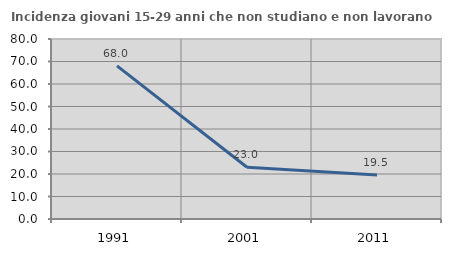
| Category | Incidenza giovani 15-29 anni che non studiano e non lavorano  |
|---|---|
| 1991.0 | 68.048 |
| 2001.0 | 23.009 |
| 2011.0 | 19.512 |